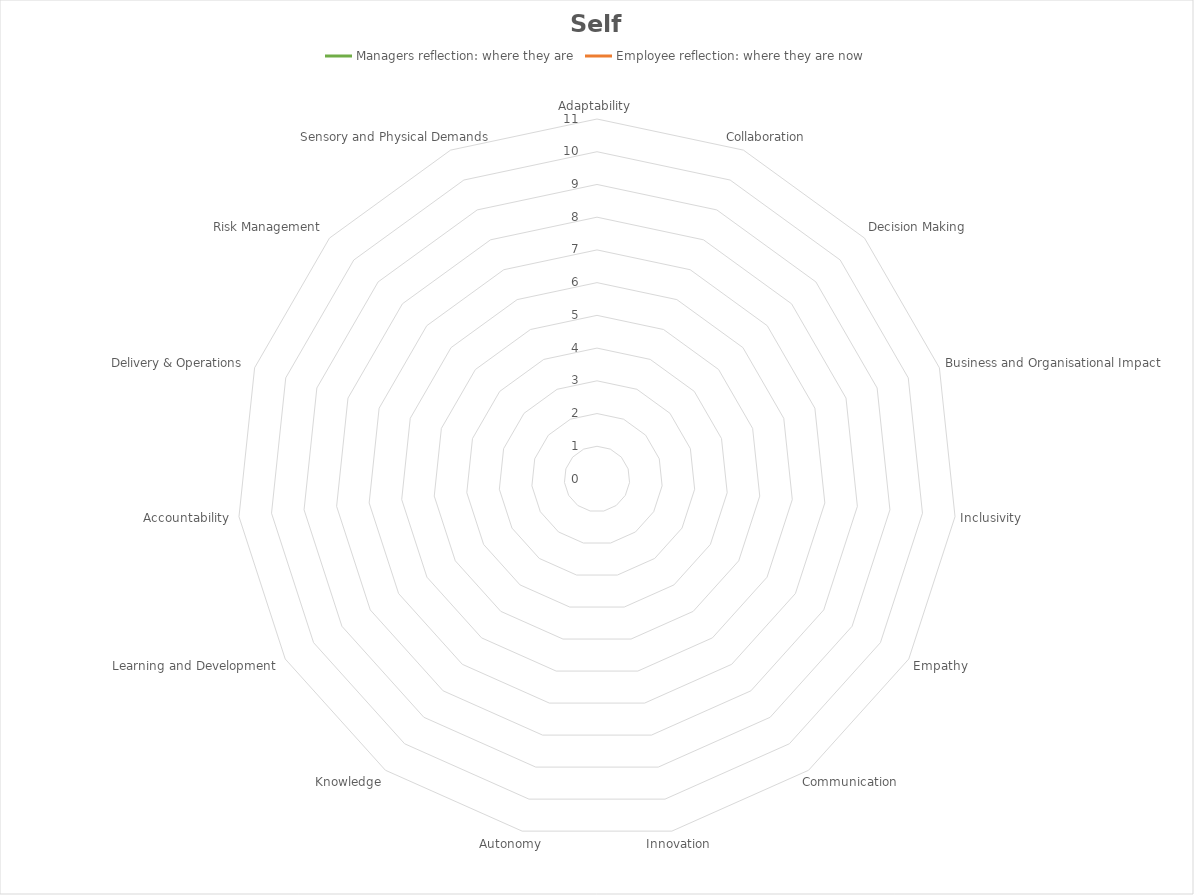
| Category | Managers reflection: where they are | Employee reflection: where they are now |
|---|---|---|
| 0 |  | 0 |
| 1 |  | 0 |
| 2 |  | 0 |
| 3 |  | 0 |
| 4 |  | 0 |
| 5 |  | 0 |
| 6 |  | 0 |
| 7 |  | 0 |
| 8 |  | 0 |
| 9 |  | 0 |
| 10 |  | 0 |
| 11 |  | 0 |
| 12 |  | 0 |
| 13 |  | 0 |
| 14 |  | 0 |